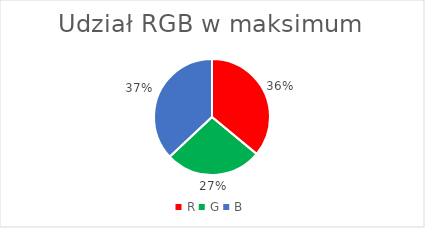
| Category | Udział |
|---|---|
| R | 0.36 |
| G | 0.27 |
| B | 0.37 |